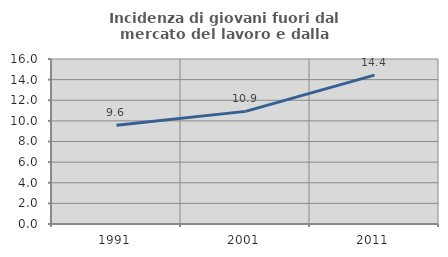
| Category | Incidenza di giovani fuori dal mercato del lavoro e dalla formazione  |
|---|---|
| 1991.0 | 9.585 |
| 2001.0 | 10.922 |
| 2011.0 | 14.44 |